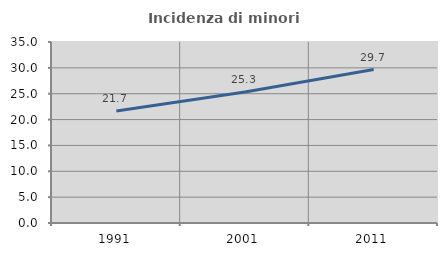
| Category | Incidenza di minori stranieri |
|---|---|
| 1991.0 | 21.667 |
| 2001.0 | 25.325 |
| 2011.0 | 29.682 |